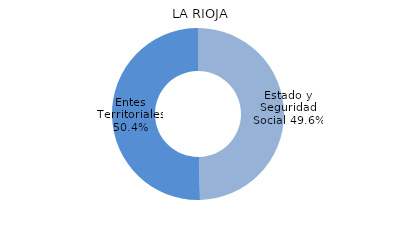
| Category | Series 0 |
|---|---|
| Estado y Seguridad Social | 40966.678 |
| Entes Territoriales | 41570.388 |